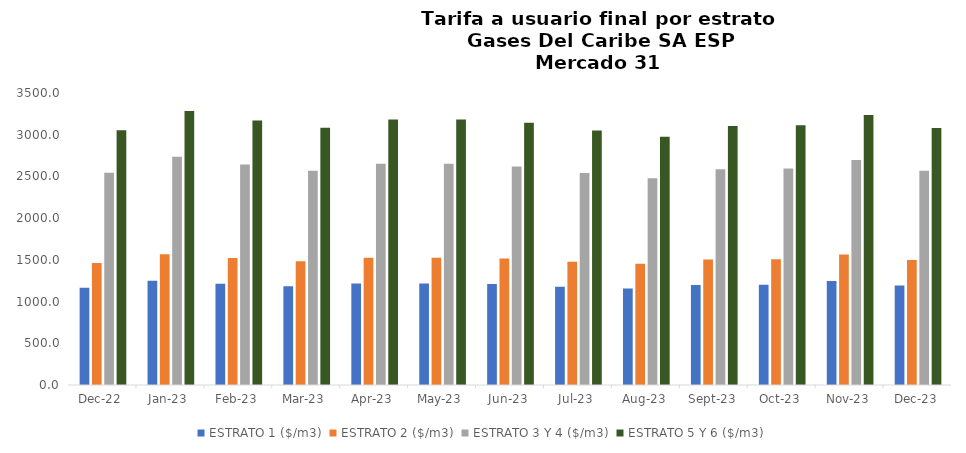
| Category | ESTRATO 1 ($/m3) | ESTRATO 2 ($/m3) | ESTRATO 3 Y 4 ($/m3) | ESTRATO 5 Y 6 ($/m3) |
|---|---|---|---|---|
| 2022-12-01 | 1166.58 | 1463.43 | 2544.24 | 3053.088 |
| 2023-01-01 | 1248.7 | 1565.89 | 2736.03 | 3283.236 |
| 2023-02-01 | 1212.89 | 1521.57 | 2641.83 | 3170.196 |
| 2023-03-01 | 1183.19 | 1482.78 | 2568.94 | 3082.728 |
| 2023-04-01 | 1215.25 | 1524.46 | 2651.33 | 3181.596 |
| 2023-05-01 | 1215.25 | 1524.46 | 2651.33 | 3181.596 |
| 2023-06-01 | 1209.41 | 1517.12 | 2619.03 | 3142.836 |
| 2023-07-01 | 1178 | 1477.97 | 2542.18 | 3050.616 |
| 2023-08-01 | 1155.93 | 1451.92 | 2479.28 | 2975.136 |
| 2023-09-01 | 1198 | 1503.27 | 2586.8 | 3104.16 |
| 2023-10-01 | 1201.13 | 1507.69 | 2594.42 | 3113.304 |
| 2023-11-01 | 1245.69 | 1564.66 | 2697.24 | 3236.688 |
| 2023-12-01 | 1191.7 | 1497.74 | 2567.03 | 3080.436 |